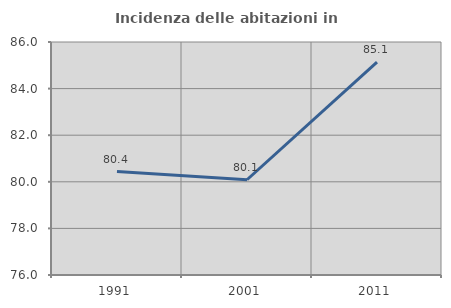
| Category | Incidenza delle abitazioni in proprietà  |
|---|---|
| 1991.0 | 80.439 |
| 2001.0 | 80.088 |
| 2011.0 | 85.14 |